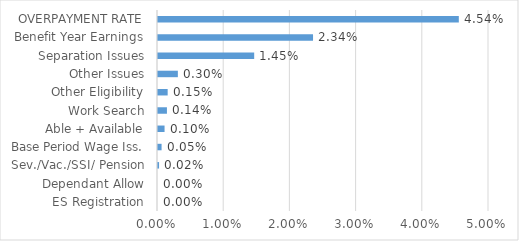
| Category | Series 0 |
|---|---|
| ES Registration | 0 |
| Dependant Allow | 0 |
| Sev./Vac./SSI/ Pension | 0 |
| Base Period Wage Iss. | 0.001 |
| Able + Available | 0.001 |
| Work Search | 0.001 |
| Other Eligibility | 0.001 |
| Other Issues | 0.003 |
| Separation Issues | 0.015 |
| Benefit Year Earnings | 0.023 |
| OVERPAYMENT RATE | 0.045 |